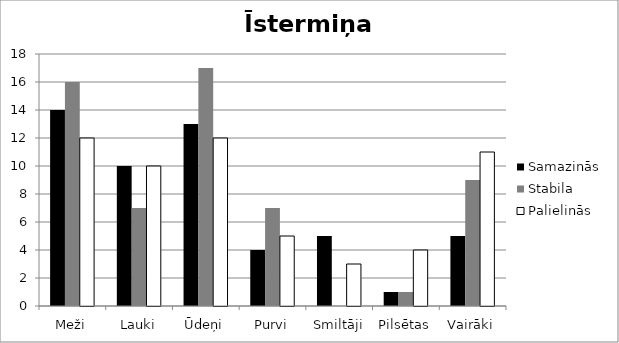
| Category | Samazinās | Stabila | Palielinās |
|---|---|---|---|
| Meži | 14 | 16 | 12 |
| Lauki | 10 | 7 | 10 |
| Ūdeņi | 13 | 17 | 12 |
| Purvi | 4 | 7 | 5 |
| Smiltāji | 5 | 0 | 3 |
| Pilsētas | 1 | 1 | 4 |
| Vairāki | 5 | 9 | 11 |